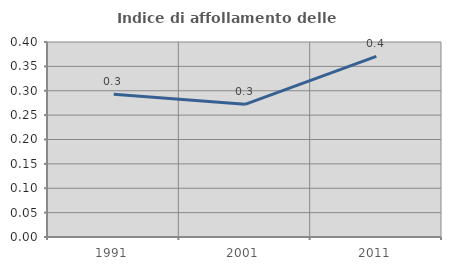
| Category | Indice di affollamento delle abitazioni  |
|---|---|
| 1991.0 | 0.293 |
| 2001.0 | 0.272 |
| 2011.0 | 0.37 |